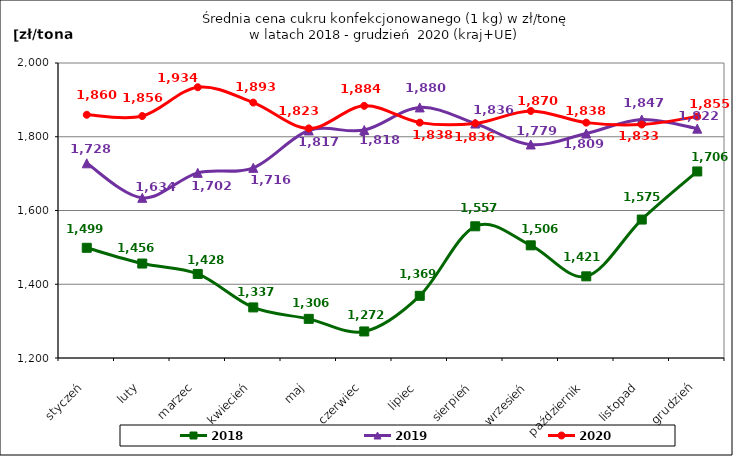
| Category | 2018 | 2019 | 2020 |
|---|---|---|---|
| styczeń | 1498.886 | 1727.969 | 1859.593 |
| luty | 1456.146 | 1634.38 | 1856.103 |
| marzec | 1427.994 | 1702.118 | 1934.235 |
| kwiecień | 1337.194 | 1715.746 | 1892.714 |
| maj | 1306.184 | 1817.049 | 1822.617 |
| czerwiec | 1272.007 | 1818.139 | 1883.791 |
| lipiec | 1368.668 | 1879.503 | 1838.309 |
| sierpień | 1557.184 | 1835.868 | 1836.22 |
| wrzesień | 1505.537 | 1779.059 | 1869.948 |
| październik | 1421.455 | 1808.715 | 1838.312 |
| listopad | 1575.442 | 1846.806 | 1833.149 |
| grudzień | 1705.916 | 1821.997 | 1854.633 |